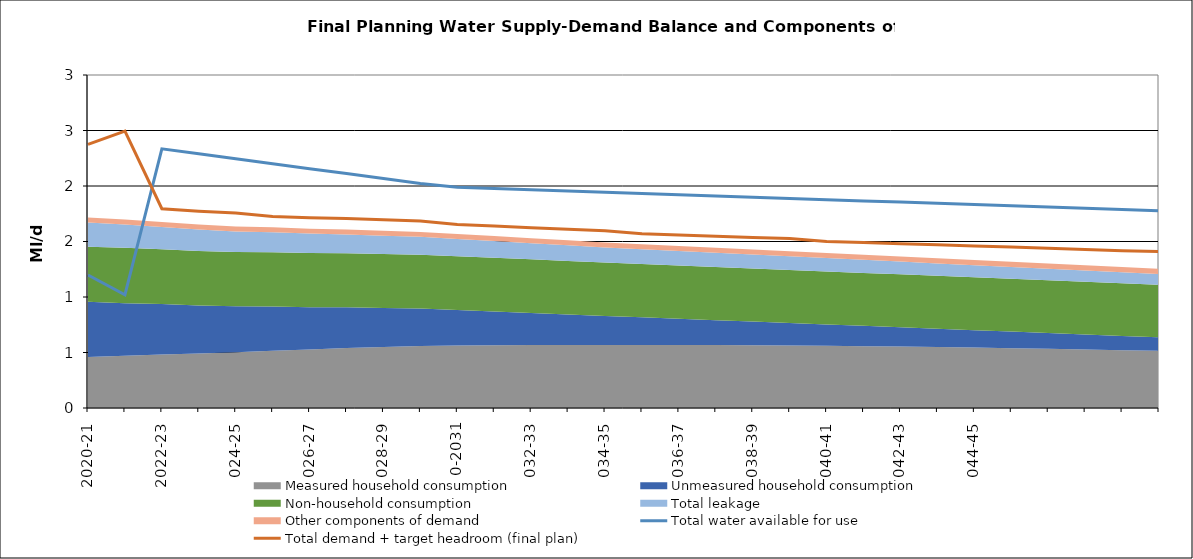
| Category | Total water available for use | Total demand + target headroom (final plan) |
|---|---|---|
| 2020-21 | 1.198 | 2.375 |
| 2021-22 | 1.02 | 2.495 |
| 2022-23 | 2.335 | 1.796 |
| 2023-24 | 2.29 | 1.773 |
| 2024-25 | 2.246 | 1.757 |
| 2025-26 | 2.201 | 1.725 |
| 2026-27 | 2.156 | 1.713 |
| 2027-28 | 2.112 | 1.707 |
| 2028-29 | 2.067 | 1.696 |
| 2029-30 | 2.022 | 1.686 |
| 2030-31 | 1.989 | 1.653 |
| 2031-32 | 1.978 | 1.639 |
| 2032-33 | 1.966 | 1.625 |
| 2033-34 | 1.955 | 1.61 |
| 2034-35 | 1.944 | 1.597 |
| 2035-36 | 1.933 | 1.57 |
| 2036-37 | 1.922 | 1.558 |
| 2037-38 | 1.911 | 1.548 |
| 2038-39 | 1.899 | 1.537 |
| 2039-40 | 1.888 | 1.526 |
| 2040-41 | 1.877 | 1.5 |
| 2041-42 | 1.866 | 1.49 |
| 2042-43 | 1.855 | 1.481 |
| 2043-44 | 1.844 | 1.47 |
| 2044-45 | 1.832 | 1.46 |
| 2045-46 | 1.821 | 1.45 |
| 2046-47 | 1.81 | 1.438 |
| 2047-48 | 1.799 | 1.427 |
| 2048-49 | 1.788 | 1.418 |
| 2049-50 | 1.777 | 1.409 |